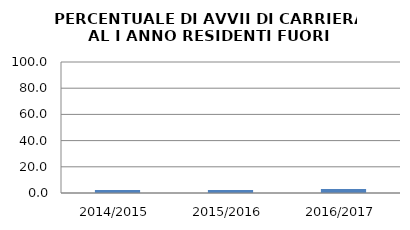
| Category | 2014/2015 2015/2016 2016/2017 |
|---|---|
| 2014/2015 | 2.326 |
| 2015/2016 | 2.299 |
| 2016/2017 | 3.125 |